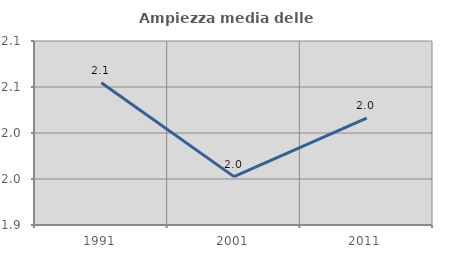
| Category | Ampiezza media delle famiglie |
|---|---|
| 1991.0 | 2.055 |
| 2001.0 | 1.953 |
| 2011.0 | 2.016 |